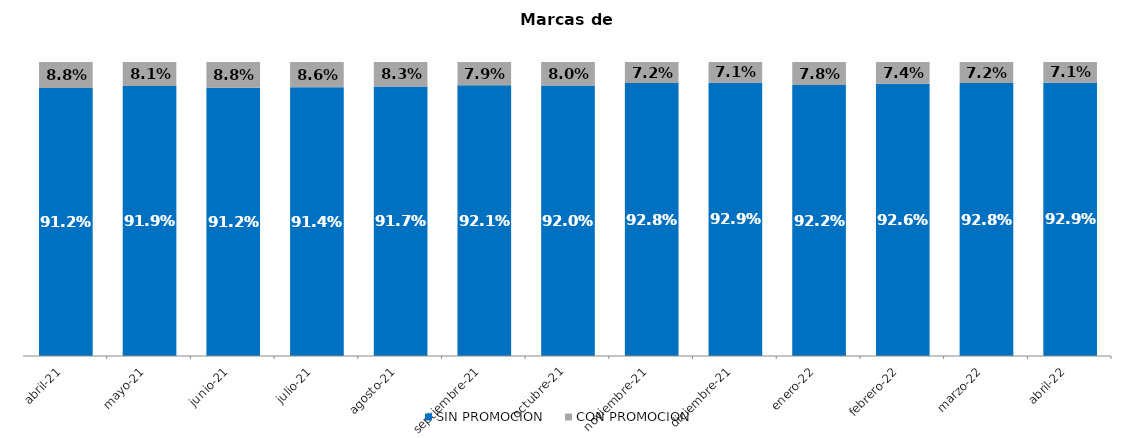
| Category | SIN PROMOCION   | CON PROMOCION   |
|---|---|---|
| 2021-04-01 | 0.912 | 0.088 |
| 2021-05-01 | 0.919 | 0.081 |
| 2021-06-01 | 0.912 | 0.088 |
| 2021-07-01 | 0.914 | 0.086 |
| 2021-08-01 | 0.917 | 0.083 |
| 2021-09-01 | 0.921 | 0.079 |
| 2021-10-01 | 0.92 | 0.08 |
| 2021-11-01 | 0.928 | 0.072 |
| 2021-12-01 | 0.929 | 0.071 |
| 2022-01-01 | 0.922 | 0.078 |
| 2022-02-01 | 0.926 | 0.074 |
| 2022-03-01 | 0.928 | 0.072 |
| 2022-04-01 | 0.929 | 0.071 |